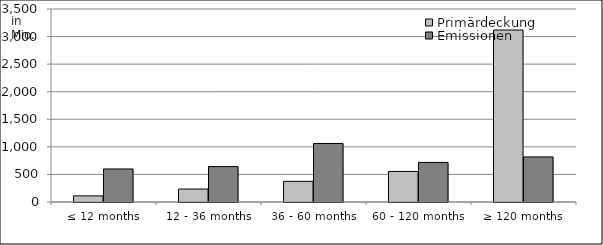
| Category | Primärdeckung | Emissionen |
|---|---|---|
| ≤ 12 months | 111055522.57 | 599056525.92 |
| 12 - 36 months | 235336769.06 | 642663906 |
| 36 - 60 months | 375145564.39 | 1060500000 |
| 60 - 120 months | 553592228.091 | 717650000 |
| ≥ 120 months | 3118844929.245 | 817723551.15 |